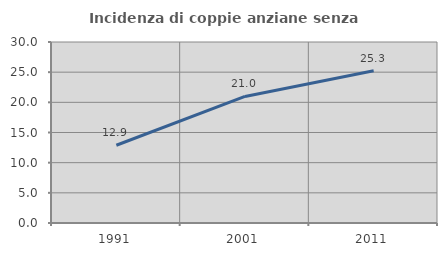
| Category | Incidenza di coppie anziane senza figli  |
|---|---|
| 1991.0 | 12.883 |
| 2001.0 | 20.98 |
| 2011.0 | 25.25 |